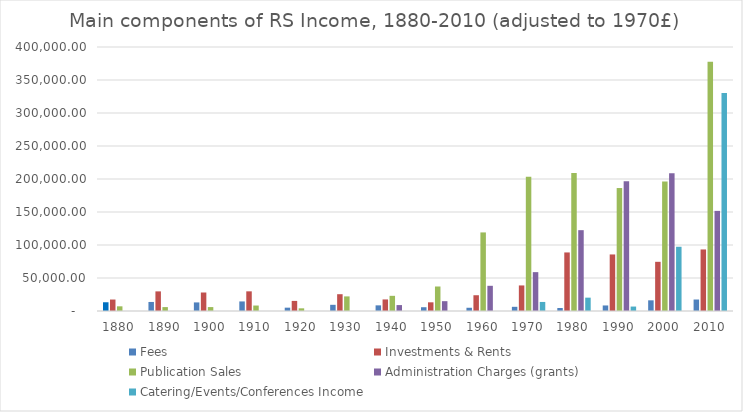
| Category | Fees | Investments & Rents | Publication Sales | Administration Charges (grants) | Catering/Events/Conferences Income |
|---|---|---|---|---|---|
| 1880.0 | 13245.5 | 17370.725 | 7090.384 | 0 | 0 |
| 1890.0 | 13703.48 | 29725.11 | 5919.392 | 0 | 0 |
| 1900.0 | 13008.411 | 28029.21 | 5944.424 | 0 | 0 |
| 1910.0 | 14495.951 | 29784.926 | 8286.778 | 0 | 0 |
| 1920.0 | 5056.306 | 15283.257 | 4057.819 | 0 | 0 |
| 1930.0 | 9378.128 | 25448.531 | 22130.668 | 0 | 0 |
| 1940.0 | 8554.224 | 17513.242 | 22978.559 | 8968.517 | 0 |
| 1950.0 | 5722.771 | 13152.59 | 37128.012 | 14894.604 | 0 |
| 1960.0 | 4904.346 | 23887.403 | 119058.829 | 38181.574 | 0 |
| 1970.0 | 6340 | 38728 | 203362 | 58879 | 13709 |
| 1980.0 | 4504.953 | 88725.248 | 209014.944 | 122464.425 | 20223.491 |
| 1990.0 | 8393.338 | 85677.514 | 186304.859 | 196511.247 | 6733.068 |
| 2000.0 | 16167.851 | 74527.148 | 196339.724 | 208853.197 | 97339.322 |
| 2010.0 | 17397.593 | 93244.242 | 377604.897 | 151693.297 | 330125.752 |